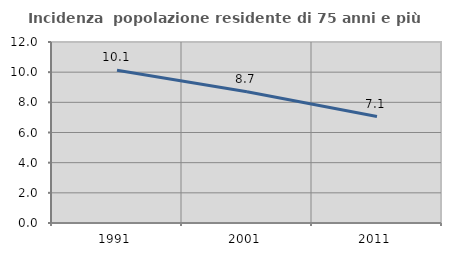
| Category | Incidenza  popolazione residente di 75 anni e più |
|---|---|
| 1991.0 | 10.127 |
| 2001.0 | 8.696 |
| 2011.0 | 7.06 |